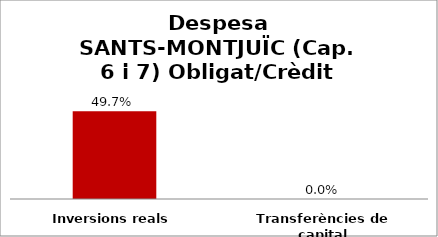
| Category | Series 0 |
|---|---|
| Inversions reals | 0.497 |
| Transferències de capital | 0 |